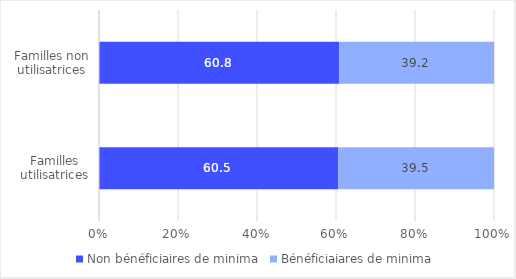
| Category | Non bénéficiaires de minima | Bénéficiaiares de minima |
|---|---|---|
| Familles utilisatrices | 60.547 | 39.453 |
| Familles non utilisatrices | 60.842 | 39.158 |